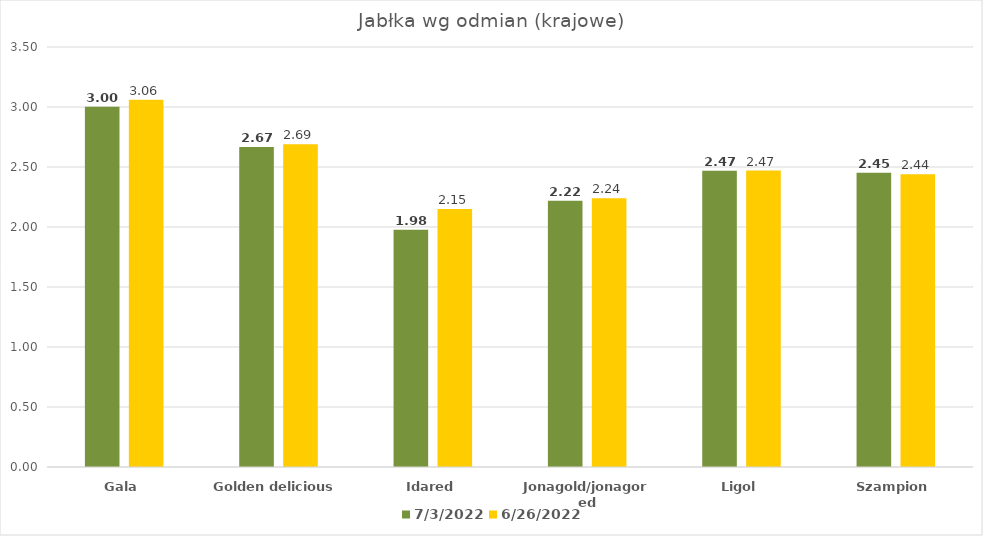
| Category | 03.07.2022 | 26.06.2022 |
|---|---|---|
| Gala | 3.002 | 3.06 |
| Golden delicious | 2.667 | 2.69 |
| Idared | 1.976 | 2.15 |
| Jonagold/jonagored | 2.218 | 2.24 |
| Ligol | 2.469 | 2.47 |
| Szampion | 2.452 | 2.44 |